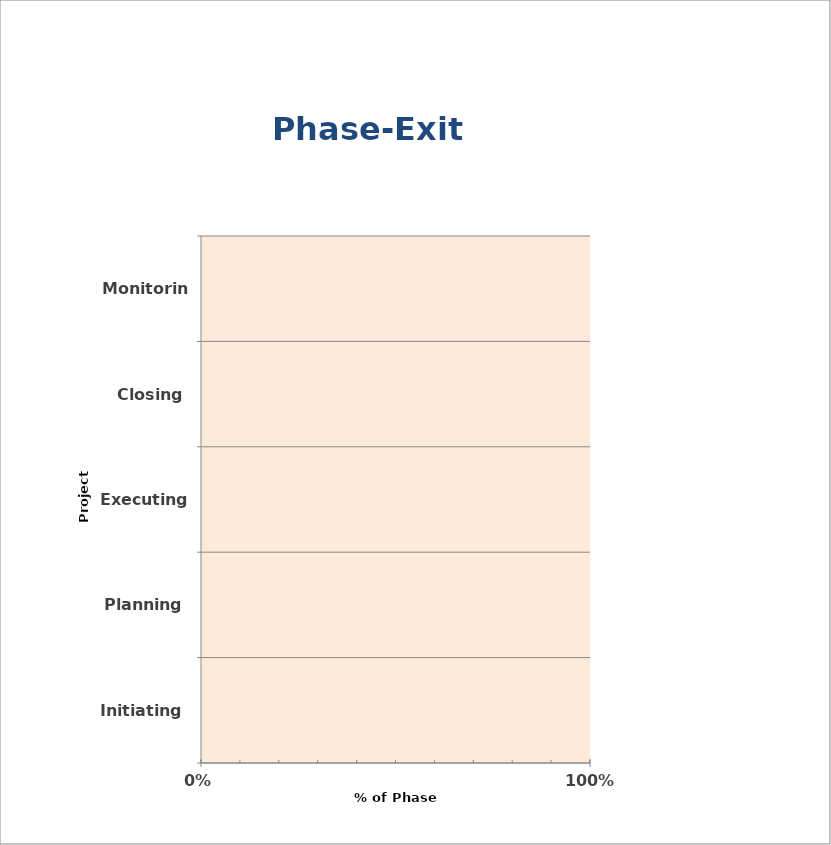
| Category | Series 0 |
|---|---|
| Initiating | 0 |
| Planning | 0 |
| Executing | 0 |
| Closing | 0 |
| Monitoring | 0 |